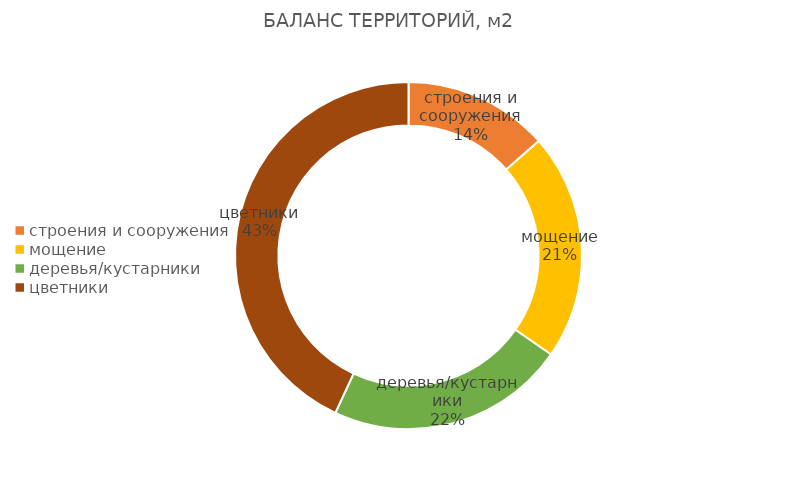
| Category | Series 0 |
|---|---|
| строения и сооружения | 12.15 |
| мощение | 19 |
| деревья/кустарники | 20 |
| цветники | 38.7 |